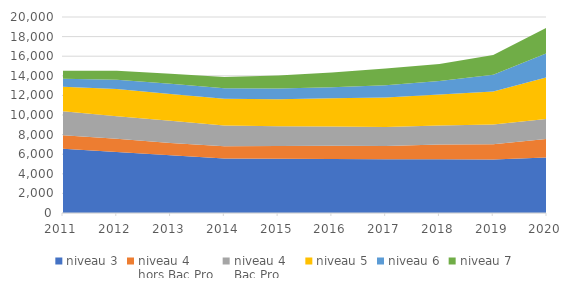
| Category | niveau 3 | niveau 4 
hors Bac Pro | niveau 4 
Bac Pro | niveau 5 | niveau 6 | niveau 7 |
|---|---|---|---|---|---|---|
| 2011.0 | 6560 | 1382 | 2440 | 2506 | 823 | 797 |
| 2012.0 | 6231 | 1357 | 2285 | 2781 | 949 | 906 |
| 2013.0 | 5884 | 1271 | 2265 | 2717 | 1062 | 1003 |
| 2014.0 | 5549 | 1265 | 2117 | 2715 | 1082 | 1154 |
| 2015.0 | 5534 | 1307 | 2012 | 2750 | 1101 | 1334 |
| 2016.0 | 5511 | 1350 | 1971 | 2889 | 1109 | 1508 |
| 2017.0 | 5479 | 1346 | 1954 | 3002 | 1253 | 1706 |
| 2018.0 | 5497 | 1486 | 1944 | 3174 | 1360 | 1742 |
| 2019.0 | 5453 | 1575 | 2007 | 3370 | 1691 | 2023 |
| 2020.0 | 5680 | 1875 | 2060 | 4250 | 2448 | 2621 |